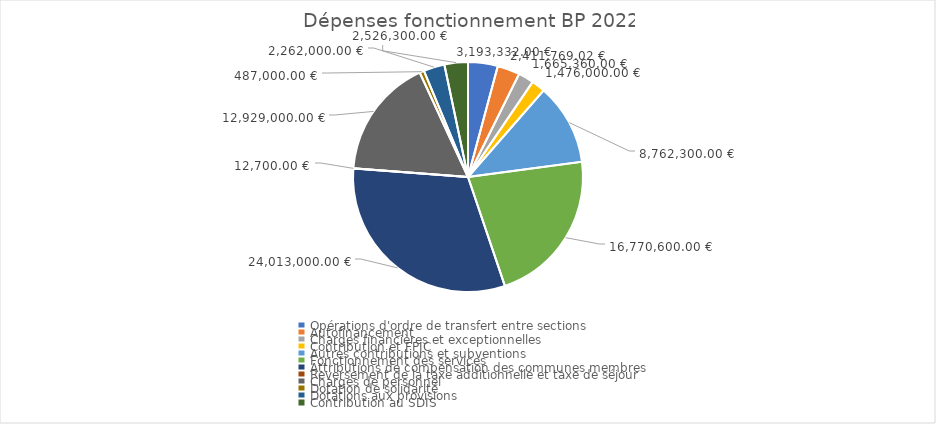
| Category | Series 0 | Series 1 |
|---|---|---|
| Opérations d'ordre de transfert entre sections | 3193332 | 0.042 |
| Autofinancement | 2411769.02 | 0.032 |
| Charges financières et exceptionnelles | 1665360 | 0.022 |
| Contribution et FPIC | 1476000 | 0.019 |
| Autres contributions et subventions | 8762300 | 0.115 |
| Fonctionnement des services | 16770600 | 0.219 |
| Attributions de compensation des communes membres | 24013000 | 0.314 |
| Reversement de la taxe additionnelle et taxe de séjour | 12700 | 0 |
| Charges de personnel | 12929000 | 0.169 |
| Dotation de solidarité | 487000 | 0.006 |
| Dotations aux provisions | 2262000 | 0.03 |
| Contribution au SDIS | 2526300 | 0.033 |